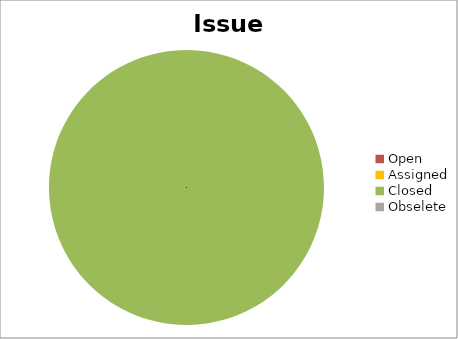
| Category | Issue Status |
|---|---|
| Open | 0 |
| Assigned | 0 |
| Closed | 13 |
| Obselete | 0 |